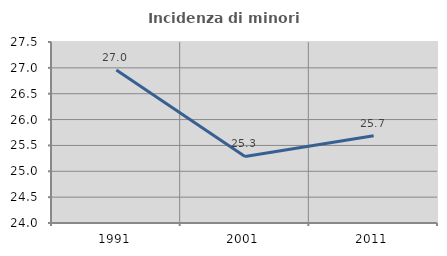
| Category | Incidenza di minori stranieri |
|---|---|
| 1991.0 | 26.957 |
| 2001.0 | 25.287 |
| 2011.0 | 25.685 |